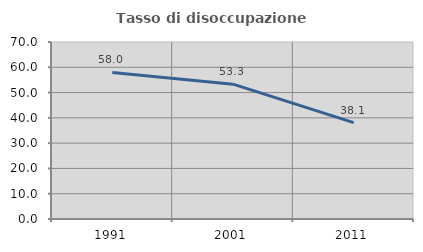
| Category | Tasso di disoccupazione giovanile  |
|---|---|
| 1991.0 | 57.955 |
| 2001.0 | 53.333 |
| 2011.0 | 38.095 |